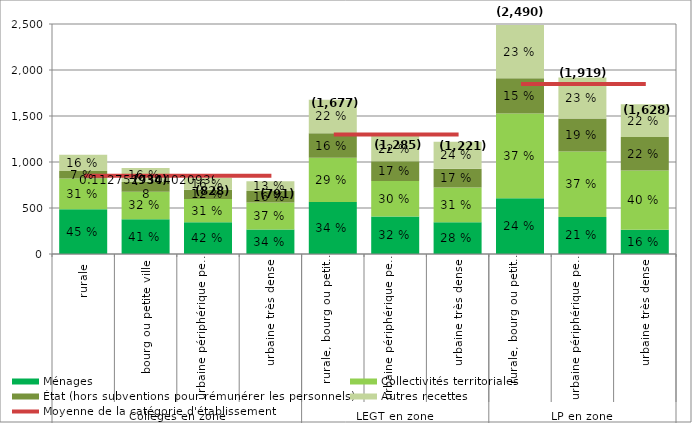
| Category | Ménages | Collectivités territoriales | État (hors subventions pour rémunérer les personnels) | Autres recettes |
|---|---|---|---|---|
| 0 | 486.76 | 335.117 | 80.787 | 177.258 |
| 1 | 378.863 | 298.278 | 105.263 | 151.173 |
| 2 | 345.191 | 253.937 | 100.462 | 128.434 |
| 3 | 267.248 | 293.112 | 124.852 | 105.769 |
| 4 | 565.62 | 480.341 | 266.357 | 364.736 |
| 5 | 408.277 | 386.263 | 213.3 | 277.238 |
| 6 | 345.857 | 377.407 | 203.669 | 294.264 |
| 7 | 606.271 | 921.985 | 381.532 | 580.475 |
| 8 | 402.71 | 711.669 | 357.466 | 446.939 |
| 9 | 263.375 | 644.246 | 362.773 | 357.168 |